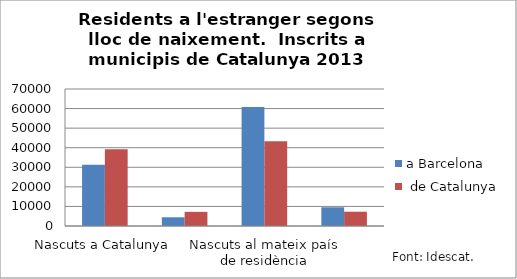
| Category | a Barcelona |  de Catalunya |
|---|---|---|
| Nascuts a Catalunya | 31260 | 39275 |
| Nascuts a la resta de l'Estat | 4461 | 7224 |
| Nascuts al mateix país de residència | 60841 | 43317 |
| Nascuts a altres països | 9567 | 7305 |